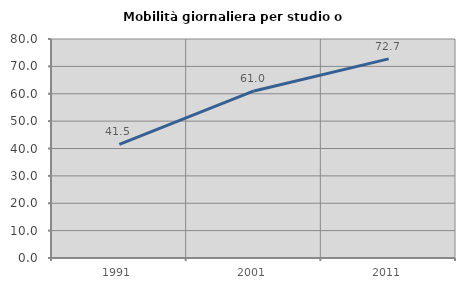
| Category | Mobilità giornaliera per studio o lavoro |
|---|---|
| 1991.0 | 41.527 |
| 2001.0 | 61.021 |
| 2011.0 | 72.727 |